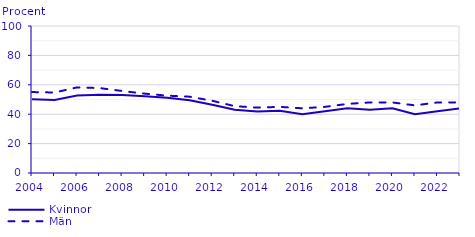
| Category | Kvinnor | Män |
|---|---|---|
| 2004.0 | 50.207 | 55.064 |
| 2005.0 | 49.629 | 54.759 |
| 2006.0 | 52.687 | 58.225 |
| 2007.0 | 53.163 | 57.779 |
| 2008.0 | 53.002 | 55.787 |
| 2009.0 | 52.267 | 53.994 |
| 2010.0 | 51.126 | 52.615 |
| 2011.0 | 49.444 | 51.908 |
| 2012.0 | 46.442 | 49.139 |
| 2013.0 | 42.982 | 45.47 |
| 2014.0 | 41.785 | 44.488 |
| 2015.0 | 42.268 | 44.996 |
| 2016.0 | 40 | 44 |
| 2017.0 | 42 | 45 |
| 2018.0 | 44 | 47 |
| 2019.0 | 43 | 48 |
| 2020.0 | 44 | 48 |
| 2021.0 | 40 | 46 |
| 2022.0 | 42 | 48 |
| 2023.0 | 44 | 48 |